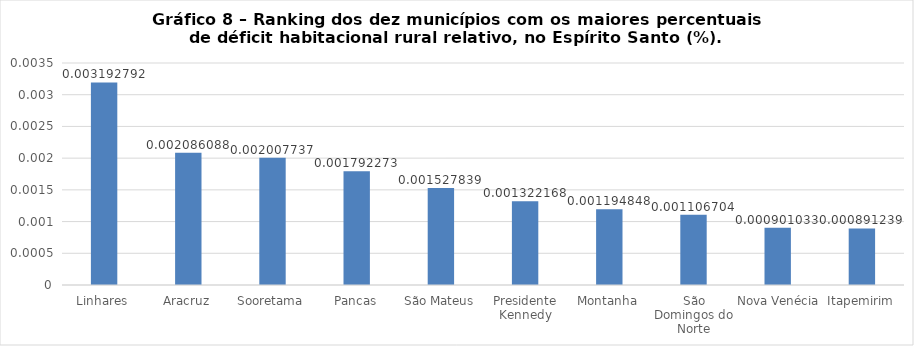
| Category | Series 0 |
|---|---|
| Linhares | 0.003 |
| Aracruz | 0.002 |
| Sooretama | 0.002 |
| Pancas | 0.002 |
| São Mateus | 0.002 |
| Presidente Kennedy | 0.001 |
| Montanha | 0.001 |
| São Domingos do Norte | 0.001 |
| Nova Venécia | 0.001 |
| Itapemirim | 0.001 |